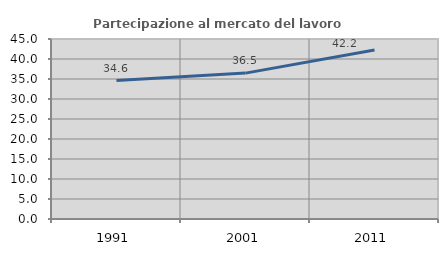
| Category | Partecipazione al mercato del lavoro  femminile |
|---|---|
| 1991.0 | 34.612 |
| 2001.0 | 36.474 |
| 2011.0 | 42.225 |